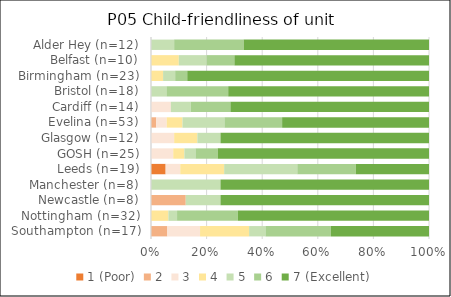
| Category | 1 (Poor) | 2 | 3 | 4 | 5 | 6 | 7 (Excellent) |
|---|---|---|---|---|---|---|---|
| Southampton (n=17) | 0 | 1 | 2 | 3 | 1 | 4 | 6 |
| Nottingham (n=32) | 0 | 0 | 0 | 2 | 1 | 7 | 22 |
| Newcastle (n=8) | 0 | 1 | 0 | 0 | 1 | 0 | 6 |
| Manchester (n=8) | 0 | 0 | 0 | 0 | 2 | 0 | 6 |
| Leeds (n=19) | 1 | 0 | 1 | 3 | 5 | 4 | 5 |
| GOSH (n=25) | 0 | 0 | 2 | 1 | 1 | 2 | 19 |
| Glasgow (n=12) | 0 | 0 | 1 | 1 | 1 | 0 | 9 |
| Evelina (n=53) | 0 | 1 | 2 | 3 | 8 | 11 | 28 |
| Cardiff (n=14) | 0 | 0 | 1 | 0 | 1 | 2 | 10 |
| Bristol (n=18) | 0 | 0 | 0 | 0 | 1 | 4 | 13 |
| Birmingham (n=23) | 0 | 0 | 0 | 1 | 1 | 1 | 20 |
| Belfast (n=10) | 0 | 0 | 0 | 1 | 1 | 1 | 7 |
| Alder Hey (n=12) | 0 | 0 | 0 | 0 | 1 | 3 | 8 |